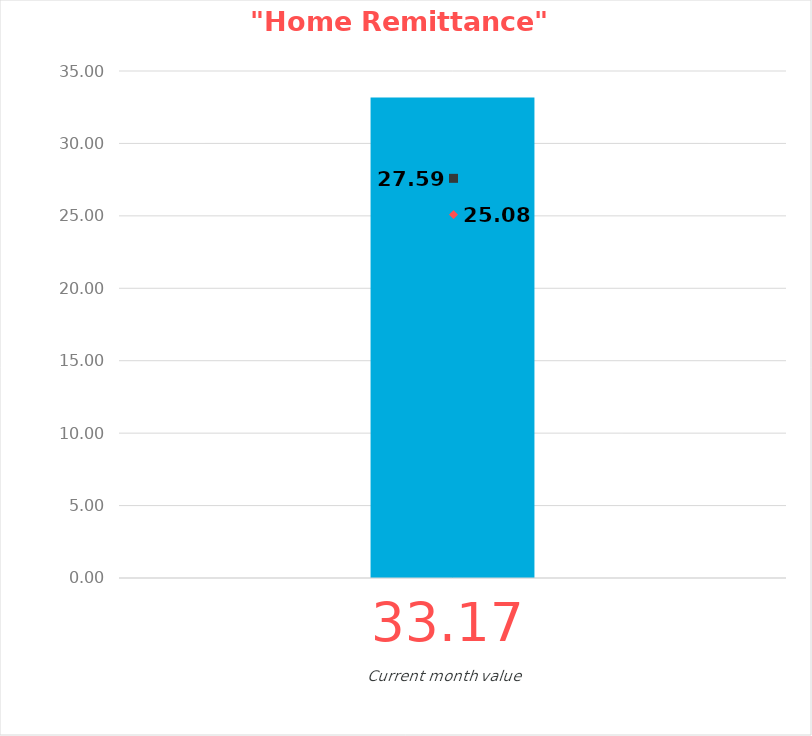
| Category | Current Month |
|---|---|
| 0 | 33.172 |